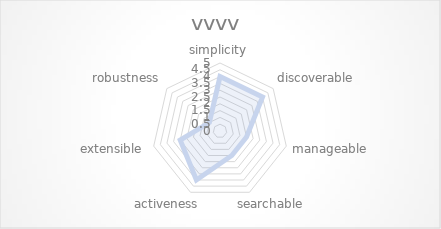
| Category | vvvv |
|---|---|
| simplicity | 4 |
| discoverable | 4 |
| manageable | 2 |
| searchable | 2 |
| activeness | 4 |
| extensible | 3 |
| robustness | 1 |